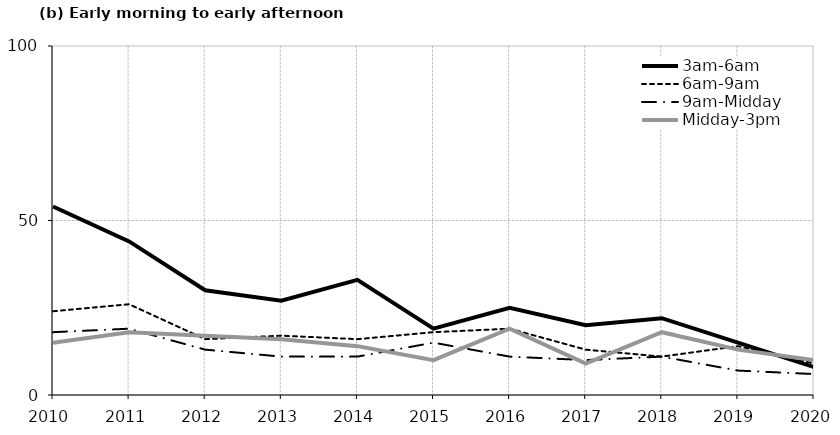
| Category | 3am-6am | 6am-9am | 9am-Midday | Midday-3pm |
|---|---|---|---|---|
| 2010.0 | 54 | 24 | 18 | 15 |
| 2011.0 | 44 | 26 | 19 | 18 |
| 2012.0 | 30 | 16 | 13 | 17 |
| 2013.0 | 27 | 17 | 11 | 16 |
| 2014.0 | 33 | 16 | 11 | 14 |
| 2015.0 | 19 | 18 | 15 | 10 |
| 2016.0 | 25 | 19 | 11 | 19 |
| 2017.0 | 20 | 13 | 10 | 9 |
| 2018.0 | 22 | 11 | 11 | 18 |
| 2019.0 | 15 | 14 | 7 | 13 |
| 2020.0 | 8 | 9 | 6 | 10 |